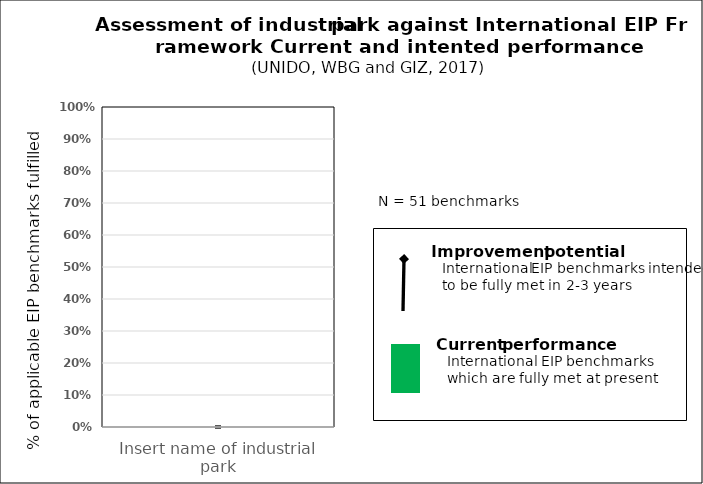
| Category | Current performance |
|---|---|
| Insert name of industrial park | 0 |